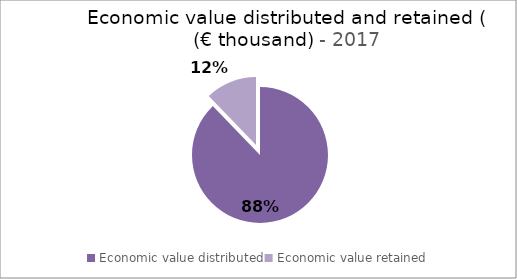
| Category | Series 1 |
|---|---|
| Economic value distributed | 2235339 |
| Economic value retained | 311367 |